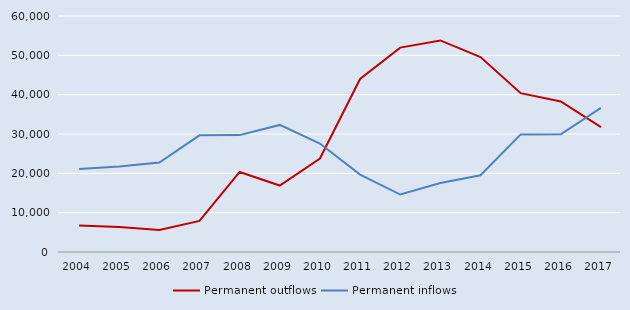
| Category | Permanent outflows | Permanent inflows |
|---|---|---|
| 2004.0 | 6757 | 21093 |
| 2005.0 | 6360 | 21741 |
| 2006.0 | 5600 | 22741 |
| 2007.0 | 7890 | 29661 |
| 2008.0 | 20357 | 29718 |
| 2009.0 | 16899 | 32307 |
| 2010.0 | 23760 | 27575 |
| 2011.0 | 43998 | 19667 |
| 2012.0 | 51958 | 14606 |
| 2013.0 | 53786 | 17554 |
| 2014.0 | 49572 | 19516 |
| 2015.0 | 40377 | 29896 |
| 2016.0 | 38273 | 29925 |
| 2017.0 | 31753 | 36639 |